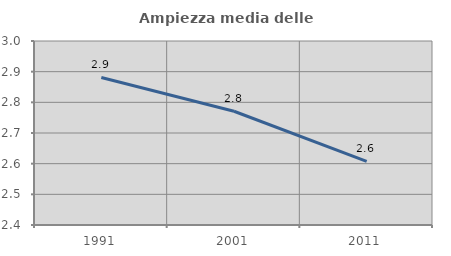
| Category | Ampiezza media delle famiglie |
|---|---|
| 1991.0 | 2.881 |
| 2001.0 | 2.771 |
| 2011.0 | 2.608 |